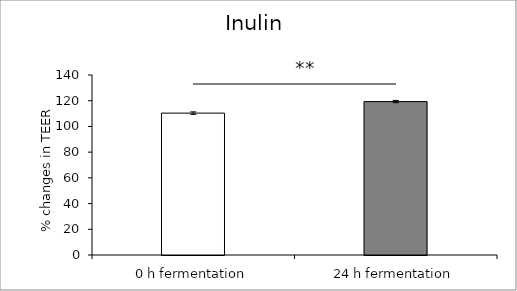
| Category | average |
|---|---|
| 0 h fermentation | 110.35 |
| 24 h fermentation | 119.335 |